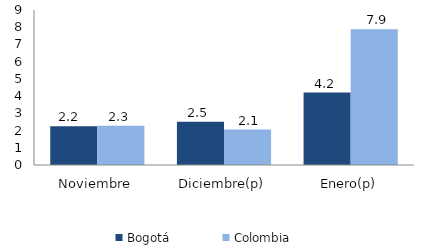
| Category | Bogotá | Colombia |
|---|---|---|
| Noviembre | 2.25 | 2.277 |
| Diciembre(p) | 2.514 | 2.059 |
| Enero(p) | 4.208 | 7.886 |